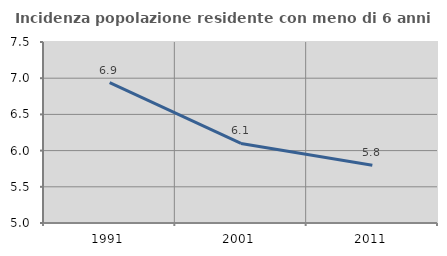
| Category | Incidenza popolazione residente con meno di 6 anni |
|---|---|
| 1991.0 | 6.939 |
| 2001.0 | 6.099 |
| 2011.0 | 5.797 |